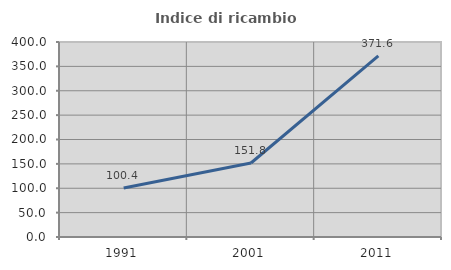
| Category | Indice di ricambio occupazionale  |
|---|---|
| 1991.0 | 100.431 |
| 2001.0 | 151.758 |
| 2011.0 | 371.614 |